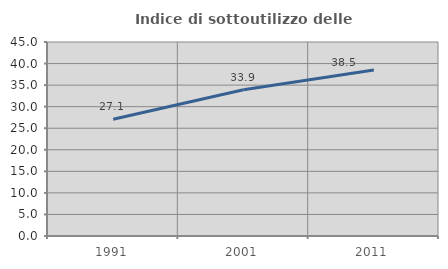
| Category | Indice di sottoutilizzo delle abitazioni  |
|---|---|
| 1991.0 | 27.081 |
| 2001.0 | 33.905 |
| 2011.0 | 38.515 |